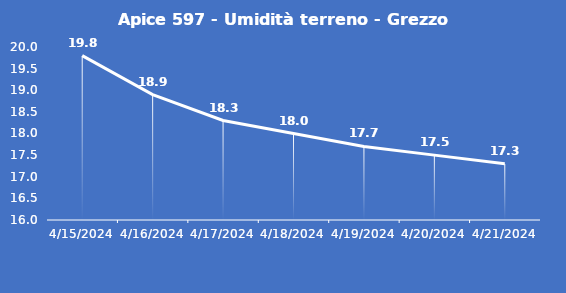
| Category | Apice 597 - Umidità terreno - Grezzo (%VWC) |
|---|---|
| 4/15/24 | 19.8 |
| 4/16/24 | 18.9 |
| 4/17/24 | 18.3 |
| 4/18/24 | 18 |
| 4/19/24 | 17.7 |
| 4/20/24 | 17.5 |
| 4/21/24 | 17.3 |